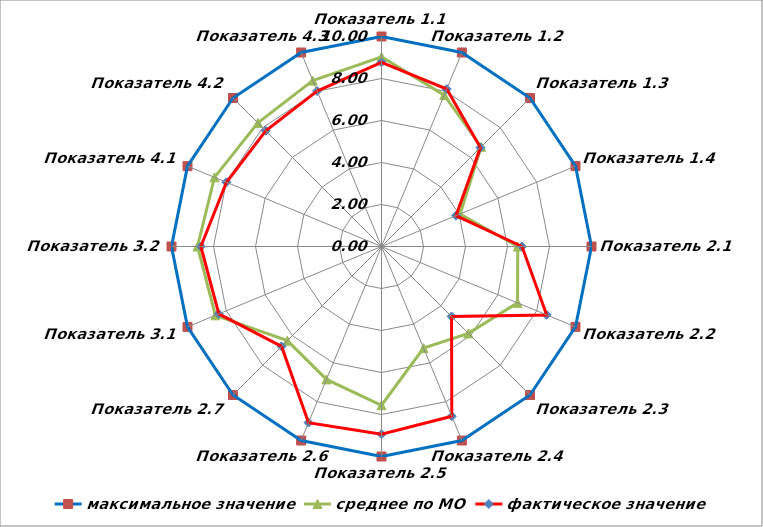
| Category | максимальное значение | среднее по МО | фактическое значение |
|---|---|---|---|
| Показатель 1.1 | 10 | 9.033 | 8.767 |
| Показатель 1.2 | 10 | 7.803 | 8.116 |
| Показатель 1.3 | 10 | 6.713 | 6.662 |
| Показатель 1.4 | 10 | 4.051 | 3.841 |
| Показатель 2.1 | 10 | 6.489 | 6.692 |
| Показатель 2.2 | 10 | 7.011 | 8.514 |
| Показатель 2.3 | 10 | 5.851 | 4.717 |
| Показатель 2.4 | 10 | 5.239 | 8.748 |
| Показатель 2.5 | 10 | 7.56 | 8.941 |
| Показатель 2.6 | 10 | 6.849 | 9.079 |
| Показатель 2.7 | 10 | 6.342 | 6.729 |
| Показатель 3.1 | 10 | 8.563 | 8.385 |
| Показатель 3.2 | 10 | 8.76 | 8.602 |
| Показатель 4.1 | 10 | 8.608 | 7.992 |
| Показатель 4.2 | 10 | 8.323 | 7.795 |
| Показатель 4.3 | 10 | 8.551 | 8.012 |